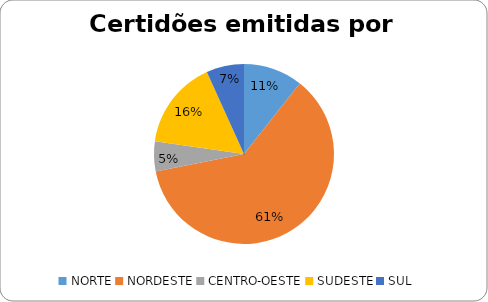
| Category | Series 0 |
|---|---|
| NORTE | 300 |
| NORDESTE | 1727 |
| CENTRO-OESTE | 151 |
| SUDESTE | 450 |
| SUL | 191 |